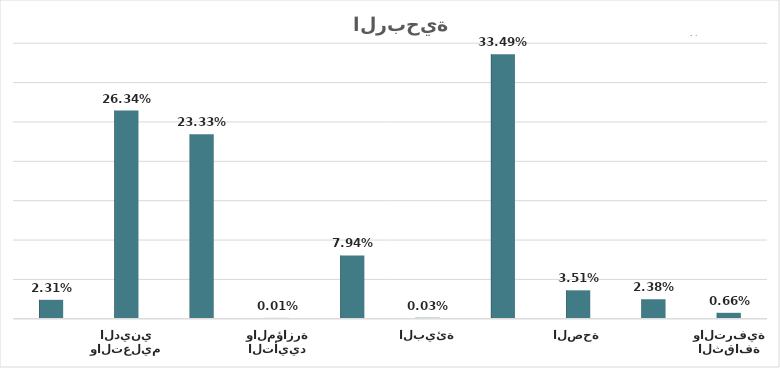
| Category | Series 0 |
|---|---|
| الثقافة والترفية | 0.007 |
| التعليم والأبحاث | 0.024 |
| الصحة | 0.035 |
| الخدمات الاجتماعية | 0.335 |
| البيئة | 0 |
| التنمية والإسكان | 0.079 |
| التأييد والمؤازرة | 0 |
| منظمات دعم العمل الخيري | 0.233 |
| منظمات الدعوة والإرشاد والتعليم الديني | 0.263 |
| الجمعيات والروابط المهنية والعلمية | 0.023 |